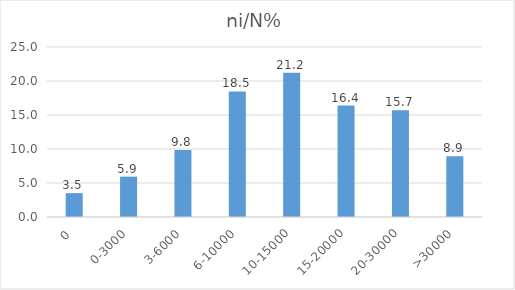
| Category | ni/N% |
|---|---|
| 0 | 3.508 |
| 0-3000 | 5.932 |
| 3-6000 | 9.839 |
| 6-10000 | 18.472 |
| 10-15000 | 21.213 |
| 15-20000 | 16.396 |
| 20-30000 | 15.71 |
| >30000 | 8.929 |